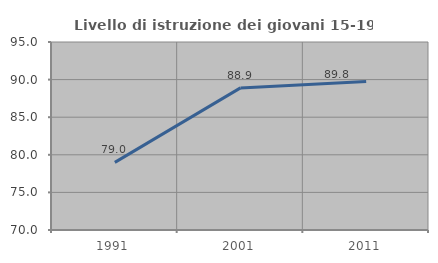
| Category | Livello di istruzione dei giovani 15-19 anni |
|---|---|
| 1991.0 | 78.991 |
| 2001.0 | 88.896 |
| 2011.0 | 89.756 |